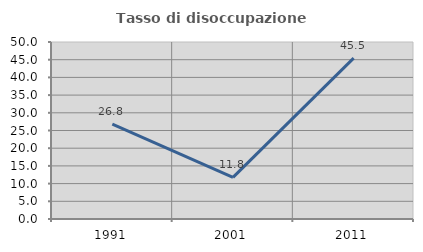
| Category | Tasso di disoccupazione giovanile  |
|---|---|
| 1991.0 | 26.786 |
| 2001.0 | 11.765 |
| 2011.0 | 45.455 |